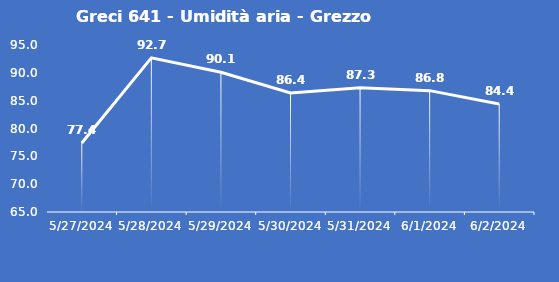
| Category | Greci 641 - Umidità aria - Grezzo (%) |
|---|---|
| 5/27/24 | 77.4 |
| 5/28/24 | 92.7 |
| 5/29/24 | 90.1 |
| 5/30/24 | 86.4 |
| 5/31/24 | 87.3 |
| 6/1/24 | 86.8 |
| 6/2/24 | 84.4 |